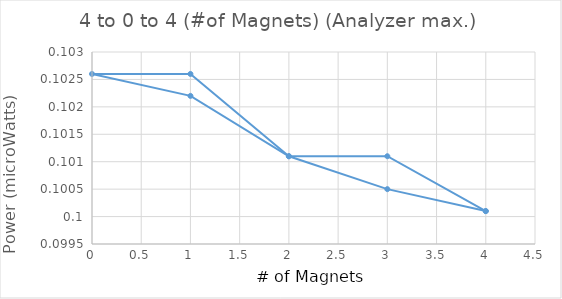
| Category | Series 0 |
|---|---|
| 4.0 | 0.1 |
| 3.0 | 0.1 |
| 2.0 | 0.101 |
| 1.0 | 0.102 |
| 0.0 | 0.103 |
| 1.0 | 0.103 |
| 2.0 | 0.101 |
| 3.0 | 0.101 |
| 4.0 | 0.1 |